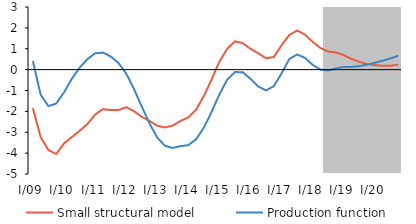
| Category | Small structural model | Production function |
|---|---|---|
| I/09 | -1.849 | 0.409 |
| II | -3.236 | -1.201 |
| III | -3.851 | -1.749 |
| IV | -4.042 | -1.626 |
| I/10 | -3.54 | -1.094 |
| II | -3.238 | -0.446 |
| III | -2.939 | 0.087 |
| IV | -2.614 | 0.5 |
| I/11 | -2.161 | 0.782 |
| II | -1.894 | 0.817 |
| III | -1.938 | 0.634 |
| IV | -1.936 | 0.327 |
| I/12 | -1.802 | -0.181 |
| II | -1.989 | -0.919 |
| III | -2.259 | -1.761 |
| IV | -2.457 | -2.571 |
| I/13 | -2.687 | -3.257 |
| II | -2.771 | -3.648 |
| III | -2.68 | -3.752 |
| IV | -2.46 | -3.665 |
| I/14 | -2.29 | -3.619 |
| II | -1.923 | -3.341 |
| III | -1.266 | -2.779 |
| IV | -0.472 | -2.023 |
| I/15 | 0.383 | -1.187 |
| II | 0.994 | -0.488 |
| III | 1.353 | -0.115 |
| IV | 1.27 | -0.129 |
| I/16 | 0.999 | -0.437 |
| II | 0.785 | -0.805 |
| III | 0.545 | -0.995 |
| IV | 0.604 | -0.794 |
| I/17 | 1.16 | -0.182 |
| II | 1.662 | 0.507 |
| III | 1.874 | 0.727 |
| IV | 1.682 | 0.566 |
| I/18 | 1.33 | 0.229 |
| II | 1.037 | 0.001 |
| III | 0.871 | -0.039 |
| IV | 0.822 | 0.057 |
| I/19 | 0.697 | 0.127 |
| II | 0.511 | 0.128 |
| III | 0.377 | 0.166 |
| IV | 0.262 | 0.239 |
| I/20 | 0.217 | 0.327 |
| II | 0.186 | 0.425 |
| III | 0.187 | 0.536 |
| IV | 0.24 | 0.661 |